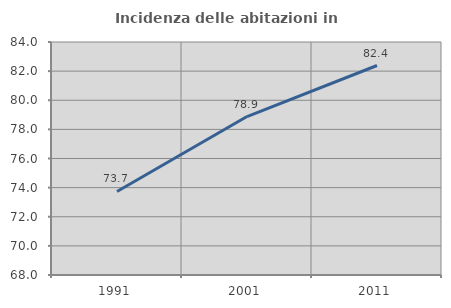
| Category | Incidenza delle abitazioni in proprietà  |
|---|---|
| 1991.0 | 73.734 |
| 2001.0 | 78.882 |
| 2011.0 | 82.385 |